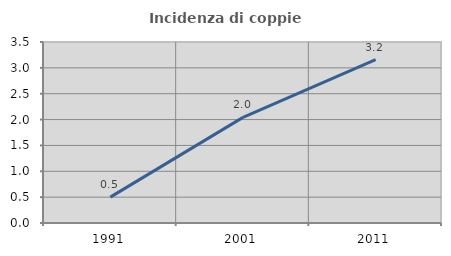
| Category | Incidenza di coppie miste |
|---|---|
| 1991.0 | 0.501 |
| 2001.0 | 2.042 |
| 2011.0 | 3.16 |